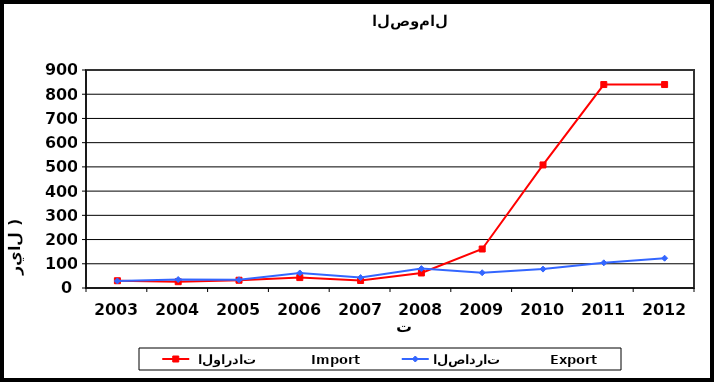
| Category |  الواردات           Import | الصادرات          Export |
|---|---|---|
| 2003.0 | 30 | 29 |
| 2004.0 | 26 | 35 |
| 2005.0 | 32 | 34 |
| 2006.0 | 43 | 62 |
| 2007.0 | 31 | 43 |
| 2008.0 | 62 | 80 |
| 2009.0 | 161 | 63 |
| 2010.0 | 508 | 78 |
| 2011.0 | 840 | 104 |
| 2012.0 | 840 | 123 |